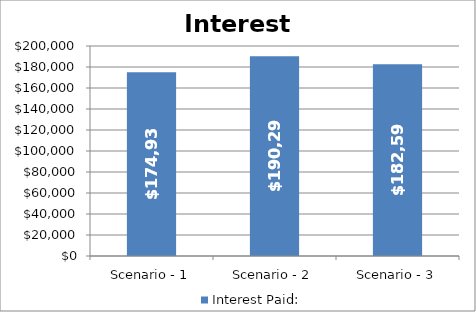
| Category | Interest Paid: |
|---|---|
| Scenario - 1 | 174938.127 |
| Scenario - 2 | 190295.205 |
| Scenario - 3 | 182592.108 |